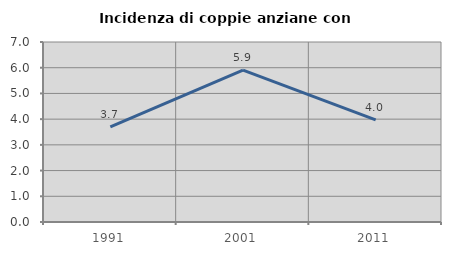
| Category | Incidenza di coppie anziane con figli |
|---|---|
| 1991.0 | 3.7 |
| 2001.0 | 5.903 |
| 2011.0 | 3.974 |